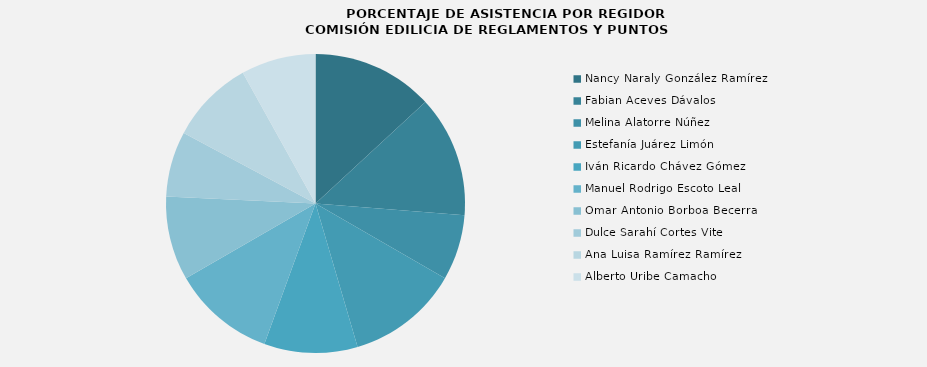
| Category | Nancy Naraly González Ramírez  |
|---|---|
| Nancy Naraly González Ramírez  | 100 |
| Fabian Aceves Dávalos | 100 |
| Melina Alatorre Núñez | 53.846 |
| Estefanía Juárez Limón | 92.308 |
| Iván Ricardo Chávez Gómez | 76.923 |
| Manuel Rodrigo Escoto Leal | 84.615 |
| Omar Antonio Borboa Becerra | 69.231 |
| Dulce Sarahí Cortes Vite | 53.846 |
| Ana Luisa Ramírez Ramírez | 69.231 |
| Alberto Uribe Camacho | 61.538 |